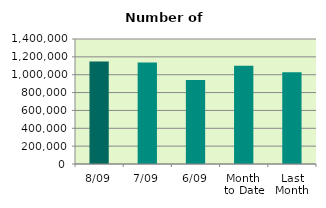
| Category | Series 0 |
|---|---|
| 8/09 | 1148318 |
| 7/09 | 1135558 |
| 6/09 | 942156 |
| Month 
to Date | 1100626 |
| Last
Month | 1026775.304 |